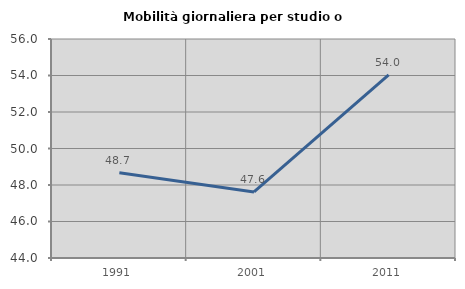
| Category | Mobilità giornaliera per studio o lavoro |
|---|---|
| 1991.0 | 48.676 |
| 2001.0 | 47.622 |
| 2011.0 | 54.041 |